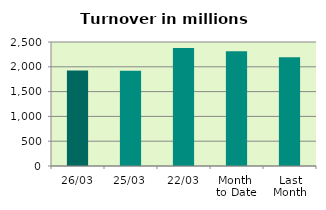
| Category | Series 0 |
|---|---|
| 26/03 | 1927.454 |
| 25/03 | 1921.479 |
| 22/03 | 2380.861 |
| Month 
to Date | 2313.775 |
| Last
Month | 2191.938 |